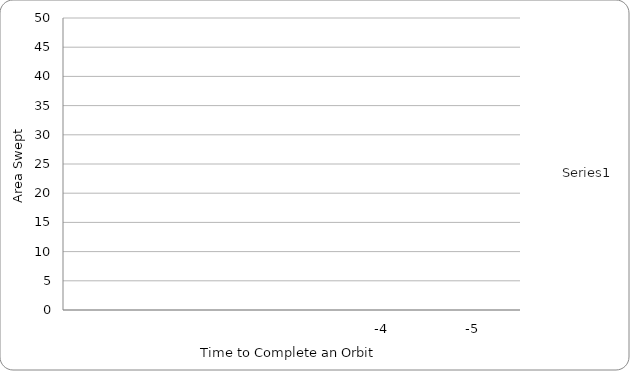
| Category | Series 0 |
|---|---|
| nan | 1 |
| nan | 2 |
| nan | 2 |
| -4.0 | 2 |
| -5.0 | 2 |